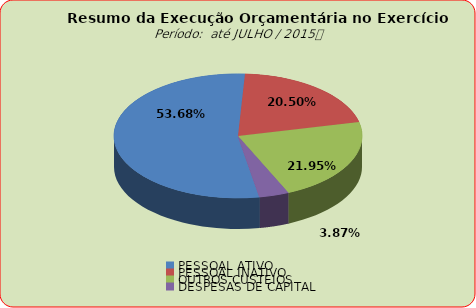
| Category | Series 0 |
|---|---|
| PESSOAL ATIVO | 72656779.44 |
| PESSOAL INATIVO | 27753454.48 |
| OUTROS CUSTEIOS | 29707569.88 |
| DESPESAS DE CAPITAL | 5237428.08 |